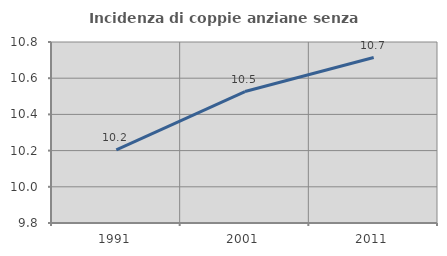
| Category | Incidenza di coppie anziane senza figli  |
|---|---|
| 1991.0 | 10.204 |
| 2001.0 | 10.526 |
| 2011.0 | 10.714 |